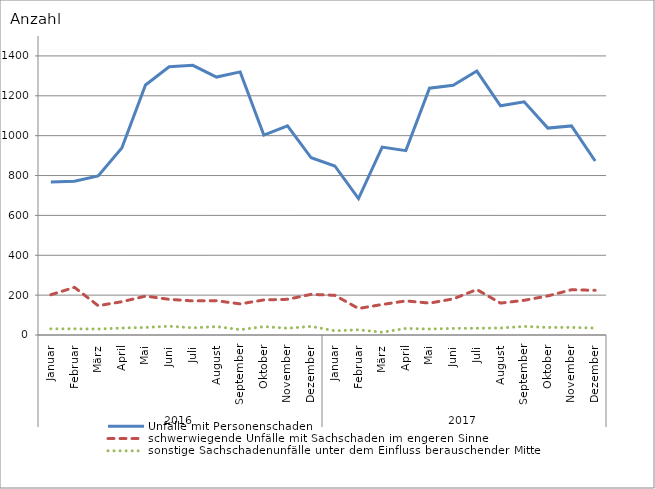
| Category | Unfälle mit Personenschaden | schwerwiegende Unfälle mit Sachschaden im engeren Sinne | sonstige Sachschadenunfälle unter dem Einfluss berauschender Mittel |
|---|---|---|---|
| 0 | 768 | 202 | 31 |
| 1 | 771 | 239 | 31 |
| 2 | 798 | 147 | 30 |
| 3 | 938 | 167 | 35 |
| 4 | 1254 | 195 | 38 |
| 5 | 1346 | 179 | 44 |
| 6 | 1353 | 171 | 36 |
| 7 | 1294 | 172 | 42 |
| 8 | 1320 | 156 | 27 |
| 9 | 1003 | 176 | 42 |
| 10 | 1049 | 179 | 34 |
| 11 | 889 | 204 | 43 |
| 12 | 848 | 199 | 21 |
| 13 | 684 | 133 | 26 |
| 14 | 943 | 153 | 14 |
| 15 | 925 | 171 | 33 |
| 16 | 1238 | 160 | 30 |
| 17 | 1253 | 181 | 33 |
| 18 | 1324 | 228 | 34 |
| 19 | 1150 | 160 | 35 |
| 20 | 1170 | 174 | 43 |
| 21 | 1038 | 196 | 38 |
| 22 | 1049 | 227 | 38 |
| 23 | 873 | 224 | 35 |